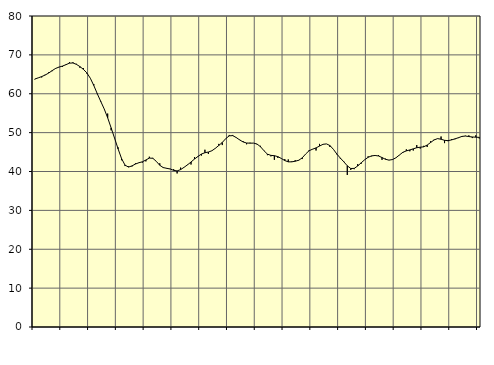
| Category | Piggar | Series 1 |
|---|---|---|
| nan | 63.7 | 63.79 |
| 87.0 | 64.1 | 64.08 |
| 87.0 | 64.2 | 64.42 |
| 87.0 | 64.9 | 64.81 |
| nan | 65.5 | 65.32 |
| 88.0 | 65.8 | 65.94 |
| 88.0 | 66.6 | 66.51 |
| 88.0 | 66.9 | 66.86 |
| nan | 66.9 | 67.12 |
| 89.0 | 67.4 | 67.48 |
| 89.0 | 68.1 | 67.87 |
| 89.0 | 68.1 | 67.92 |
| nan | 67.7 | 67.56 |
| 90.0 | 66.7 | 66.99 |
| 90.0 | 66.6 | 66.29 |
| 90.0 | 65.2 | 65.37 |
| nan | 64 | 64 |
| 91.0 | 62.5 | 62.14 |
| 91.0 | 59.9 | 60.03 |
| 91.0 | 57.9 | 58.04 |
| nan | 56.1 | 56.1 |
| 92.0 | 54.9 | 53.82 |
| 92.0 | 50.6 | 51.22 |
| 92.0 | 48.6 | 48.54 |
| nan | 46.2 | 45.82 |
| 93.0 | 42.9 | 43.33 |
| 93.0 | 41.4 | 41.64 |
| 93.0 | 41.3 | 41.14 |
| nan | 41.3 | 41.44 |
| 94.0 | 42.1 | 41.92 |
| 94.0 | 42.3 | 42.26 |
| 94.0 | 42.3 | 42.5 |
| nan | 42.6 | 42.96 |
| 95.0 | 43.8 | 43.45 |
| 95.0 | 43.5 | 43.4 |
| 95.0 | 42.6 | 42.61 |
| nan | 42.1 | 41.6 |
| 96.0 | 40.9 | 41.01 |
| 96.0 | 40.9 | 40.82 |
| 96.0 | 40.7 | 40.64 |
| nan | 40.6 | 40.3 |
| 97.0 | 39.5 | 40.15 |
| 97.0 | 41 | 40.49 |
| 97.0 | 41.1 | 41.08 |
| nan | 41.8 | 41.72 |
| 98.0 | 41.8 | 42.44 |
| 98.0 | 43.7 | 43.2 |
| 98.0 | 43.8 | 43.87 |
| nan | 44.1 | 44.49 |
| 99.0 | 45.6 | 44.83 |
| 99.0 | 44.5 | 45.01 |
| 99.0 | 45.3 | 45.33 |
| nan | 46 | 45.96 |
| 0.0 | 47.1 | 46.7 |
| 0.0 | 46.8 | 47.47 |
| 0.0 | 48.5 | 48.45 |
| nan | 49.4 | 49.17 |
| 1.0 | 49.4 | 49.23 |
| 1.0 | 48.8 | 48.75 |
| 1.0 | 48.2 | 48.13 |
| nan | 47.8 | 47.6 |
| 2.0 | 47 | 47.33 |
| 2.0 | 47.4 | 47.29 |
| 2.0 | 47.3 | 47.3 |
| nan | 47 | 47.07 |
| 3.0 | 46.6 | 46.38 |
| 3.0 | 45.3 | 45.35 |
| 3.0 | 44.2 | 44.47 |
| nan | 43.9 | 44.15 |
| 4.0 | 43 | 44.07 |
| 4.0 | 43.5 | 43.83 |
| 4.0 | 43.4 | 43.36 |
| nan | 43.2 | 42.81 |
| 5.0 | 43.1 | 42.48 |
| 5.0 | 42.6 | 42.48 |
| 5.0 | 42.9 | 42.64 |
| nan | 42.8 | 42.89 |
| 6.0 | 43.2 | 43.49 |
| 6.0 | 44.5 | 44.49 |
| 6.0 | 45.5 | 45.34 |
| nan | 45.7 | 45.74 |
| 7.0 | 45.4 | 46.07 |
| 7.0 | 47.1 | 46.54 |
| 7.0 | 47 | 46.99 |
| nan | 47.1 | 47.1 |
| 8.0 | 46.3 | 46.68 |
| 8.0 | 45.7 | 45.71 |
| 8.0 | 44.4 | 44.48 |
| nan | 43.3 | 43.45 |
| 9.0 | 42.6 | 42.49 |
| 9.0 | 39.1 | 41.47 |
| 9.0 | 40.4 | 40.77 |
| nan | 40.6 | 40.8 |
| 10.0 | 41.9 | 41.42 |
| 10.0 | 42 | 42.24 |
| 10.0 | 43 | 43.02 |
| nan | 43.9 | 43.65 |
| 11.0 | 43.9 | 44.02 |
| 11.0 | 44.1 | 44.12 |
| 11.0 | 44.2 | 43.99 |
| nan | 43 | 43.59 |
| 12.0 | 43.3 | 43.14 |
| 12.0 | 42.9 | 42.93 |
| 12.0 | 43 | 43.07 |
| nan | 43.5 | 43.52 |
| 13.0 | 44.2 | 44.24 |
| 13.0 | 44.8 | 44.94 |
| 13.0 | 45.7 | 45.3 |
| nan | 45.2 | 45.55 |
| 14.0 | 45.4 | 45.83 |
| 14.0 | 46.8 | 46.12 |
| 14.0 | 45.9 | 46.25 |
| nan | 46.6 | 46.35 |
| 15.0 | 46.3 | 46.8 |
| 15.0 | 47.8 | 47.47 |
| 15.0 | 48.2 | 48.12 |
| nan | 48.5 | 48.46 |
| 16.0 | 49 | 48.3 |
| 16.0 | 47.3 | 48.02 |
| 16.0 | 47.8 | 47.94 |
| nan | 48.3 | 48.12 |
| 17.0 | 48.3 | 48.4 |
| 17.0 | 48.6 | 48.69 |
| 17.0 | 48.9 | 49.02 |
| nan | 49.2 | 49.12 |
| 18.0 | 49.3 | 48.99 |
| 18.0 | 48.6 | 48.88 |
| 18.0 | 49.3 | 48.83 |
| nan | 48.5 | 48.78 |